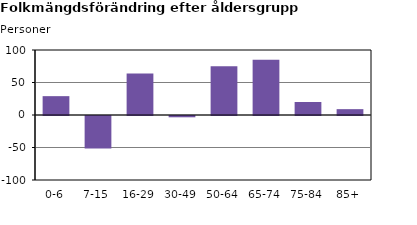
| Category | Series 2 |
|---|---|
| 0-6 | 29 |
| 7-15 | -50 |
| 16-29 | 64 |
| 30-49 | -2 |
| 50-64 | 75 |
| 65-74 | 85 |
| 75-84 | 20 |
| 85+ | 9 |